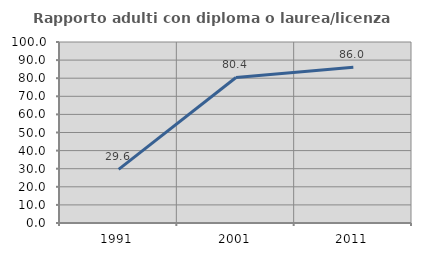
| Category | Rapporto adulti con diploma o laurea/licenza media  |
|---|---|
| 1991.0 | 29.612 |
| 2001.0 | 80.392 |
| 2011.0 | 86.019 |